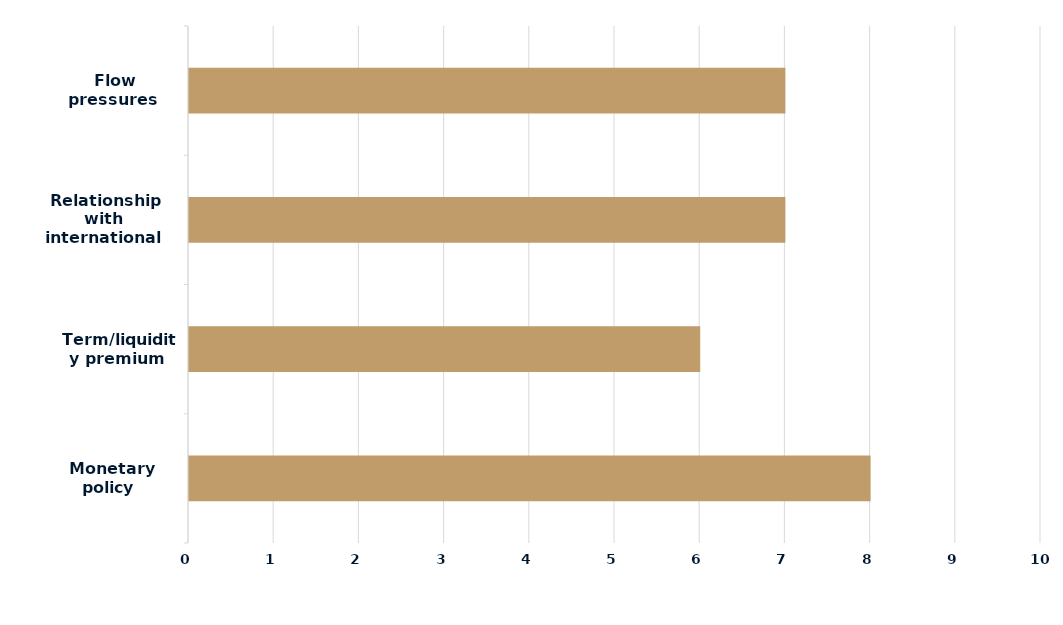
| Category | Series 0 |
|---|---|
|  Monetary policy | 8 |
|  Term/liquidity premium | 6 |
|  Relationship with international curves | 7 |
|  Flow pressures | 7 |